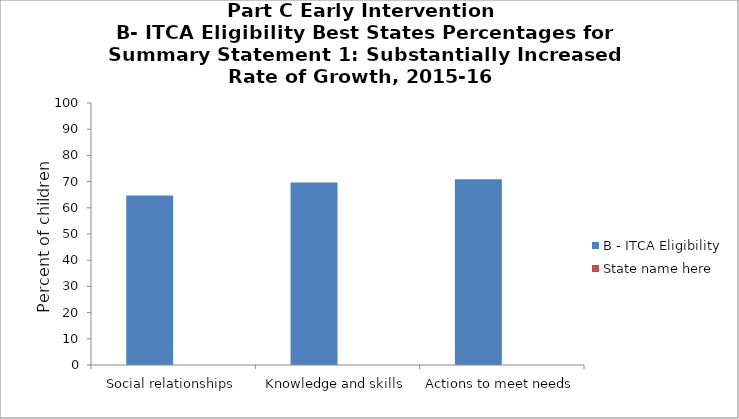
| Category | B - ITCA Eligibility | State name here |
|---|---|---|
| Social relationships | 64.7 |  |
| Knowledge and skills | 69.7 |  |
| Actions to meet needs | 70.9 |  |